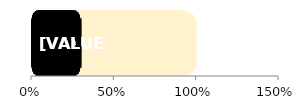
| Category | Total | Female |
|---|---|---|
| 0 | 1 | 0.301 |